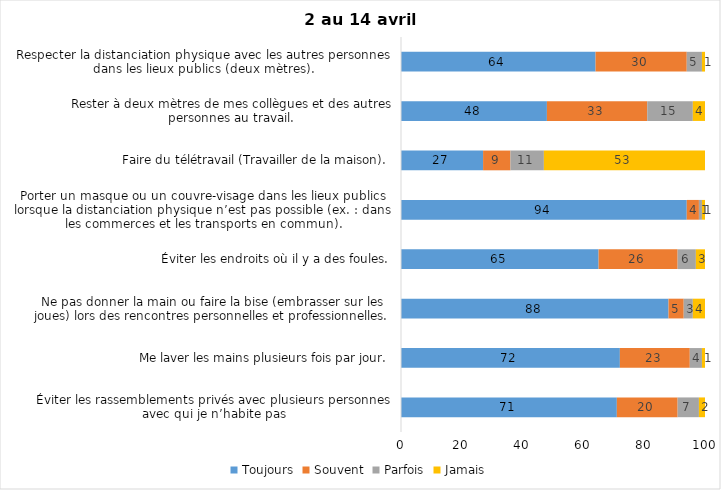
| Category | Toujours | Souvent | Parfois | Jamais |
|---|---|---|---|---|
| Éviter les rassemblements privés avec plusieurs personnes avec qui je n’habite pas | 71 | 20 | 7 | 2 |
| Me laver les mains plusieurs fois par jour. | 72 | 23 | 4 | 1 |
| Ne pas donner la main ou faire la bise (embrasser sur les joues) lors des rencontres personnelles et professionnelles. | 88 | 5 | 3 | 4 |
| Éviter les endroits où il y a des foules. | 65 | 26 | 6 | 3 |
| Porter un masque ou un couvre-visage dans les lieux publics lorsque la distanciation physique n’est pas possible (ex. : dans les commerces et les transports en commun). | 94 | 4 | 1 | 1 |
| Faire du télétravail (Travailler de la maison). | 27 | 9 | 11 | 53 |
| Rester à deux mètres de mes collègues et des autres personnes au travail. | 48 | 33 | 15 | 4 |
| Respecter la distanciation physique avec les autres personnes dans les lieux publics (deux mètres). | 64 | 30 | 5 | 1 |